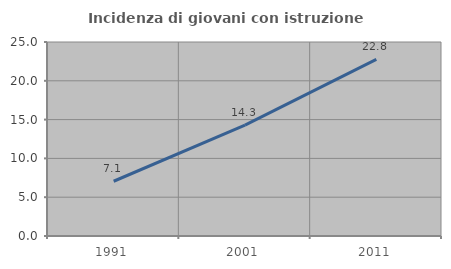
| Category | Incidenza di giovani con istruzione universitaria |
|---|---|
| 1991.0 | 7.056 |
| 2001.0 | 14.297 |
| 2011.0 | 22.77 |